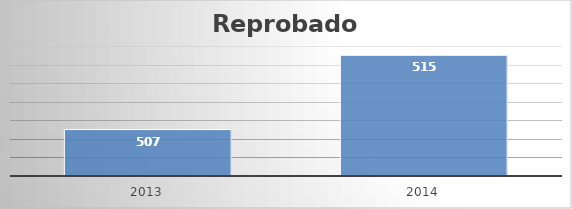
| Category | Reprobados |
|---|---|
| 2013.0 | 507 |
| 2014.0 | 515 |